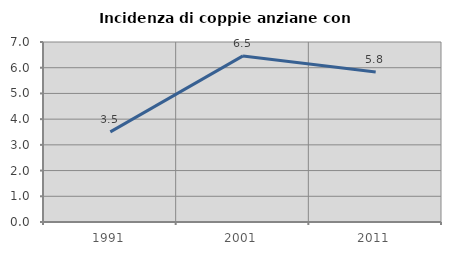
| Category | Incidenza di coppie anziane con figli |
|---|---|
| 1991.0 | 3.505 |
| 2001.0 | 6.46 |
| 2011.0 | 5.836 |